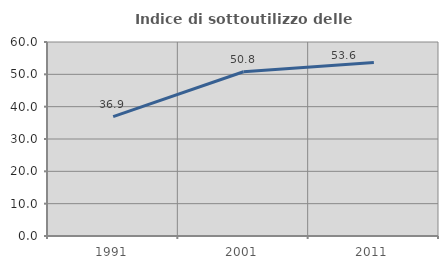
| Category | Indice di sottoutilizzo delle abitazioni  |
|---|---|
| 1991.0 | 36.917 |
| 2001.0 | 50.791 |
| 2011.0 | 53.649 |